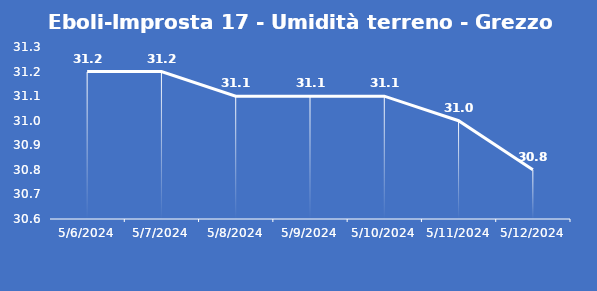
| Category | Eboli-Improsta 17 - Umidità terreno - Grezzo (%VWC) |
|---|---|
| 5/6/24 | 31.2 |
| 5/7/24 | 31.2 |
| 5/8/24 | 31.1 |
| 5/9/24 | 31.1 |
| 5/10/24 | 31.1 |
| 5/11/24 | 31 |
| 5/12/24 | 30.8 |